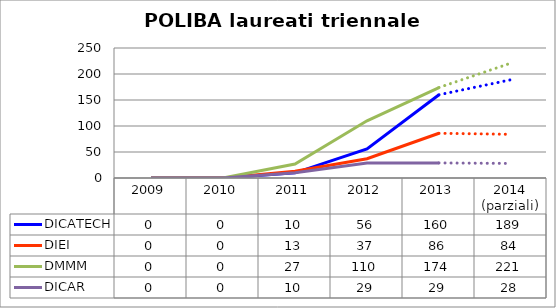
| Category | DICATECH | DIEI  | DMMM | DICAR |
|---|---|---|---|---|
| 2009 | 0 | 0 | 0 | 0 |
| 2010 | 0 | 0 | 0 | 0 |
| 2011 | 10 | 13 | 27 | 10 |
| 2012 | 56 | 37 | 110 | 29 |
| 2013 | 160 | 86 | 174 | 29 |
| 2014
(parziali) | 189 | 84 | 221 | 28 |